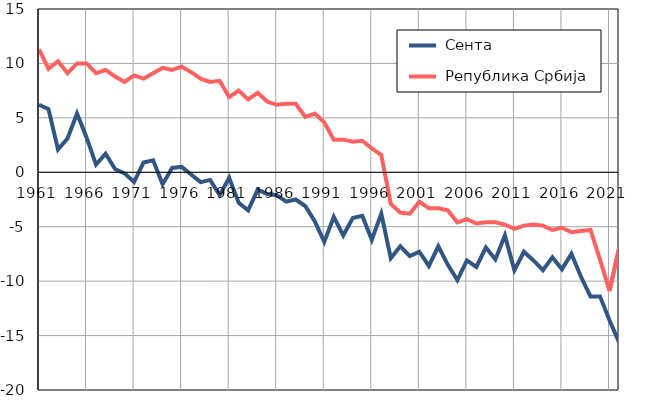
| Category |  Сента |  Република Србија |
|---|---|---|
| 1961.0 | 6.2 | 11.3 |
| 1962.0 | 5.8 | 9.5 |
| 1963.0 | 2.1 | 10.2 |
| 1964.0 | 3.1 | 9.1 |
| 1965.0 | 5.4 | 10 |
| 1966.0 | 3.2 | 10 |
| 1967.0 | 0.7 | 9.1 |
| 1968.0 | 1.7 | 9.4 |
| 1969.0 | 0.3 | 8.8 |
| 1970.0 | -0.1 | 8.3 |
| 1971.0 | -0.9 | 8.9 |
| 1972.0 | 0.9 | 8.6 |
| 1973.0 | 1.1 | 9.1 |
| 1974.0 | -1.1 | 9.6 |
| 1975.0 | 0.4 | 9.4 |
| 1976.0 | 0.5 | 9.7 |
| 1977.0 | -0.2 | 9.2 |
| 1978.0 | -0.9 | 8.6 |
| 1979.0 | -0.7 | 8.3 |
| 1980.0 | -2.1 | 8.4 |
| 1981.0 | -0.5 | 6.9 |
| 1982.0 | -2.8 | 7.5 |
| 1983.0 | -3.5 | 6.7 |
| 1984.0 | -1.6 | 7.3 |
| 1985.0 | -2 | 6.5 |
| 1986.0 | -2.1 | 6.2 |
| 1987.0 | -2.7 | 6.3 |
| 1988.0 | -2.5 | 6.3 |
| 1989.0 | -3.1 | 5.1 |
| 1990.0 | -4.5 | 5.4 |
| 1991.0 | -6.4 | 4.6 |
| 1992.0 | -4.1 | 3 |
| 1993.0 | -5.8 | 3 |
| 1994.0 | -4.2 | 2.8 |
| 1995.0 | -4 | 2.9 |
| 1996.0 | -6.2 | 2.2 |
| 1997.0 | -3.8 | 1.6 |
| 1998.0 | -7.9 | -2.9 |
| 1999.0 | -6.8 | -3.7 |
| 2000.0 | -7.7 | -3.8 |
| 2001.0 | -7.3 | -2.7 |
| 2002.0 | -8.6 | -3.3 |
| 2003.0 | -6.8 | -3.3 |
| 2004.0 | -8.5 | -3.5 |
| 2005.0 | -9.9 | -4.6 |
| 2006.0 | -8.1 | -4.3 |
| 2007.0 | -8.7 | -4.7 |
| 2008.0 | -6.9 | -4.6 |
| 2009.0 | -8 | -4.6 |
| 2010.0 | -5.8 | -4.8 |
| 2011.0 | -9 | -5.2 |
| 2012.0 | -7.3 | -4.9 |
| 2013.0 | -8.1 | -4.8 |
| 2014.0 | -9 | -4.9 |
| 2015.0 | -7.8 | -5.3 |
| 2016.0 | -8.9 | -5.1 |
| 2017.0 | -7.5 | -5.5 |
| 2018.0 | -9.6 | -5.4 |
| 2019.0 | -11.4 | -5.3 |
| 2020.0 | -11.4 | -8 |
| 2021.0 | -13.6 | -10.9 |
| 2022.0 | -15.6 | -7 |